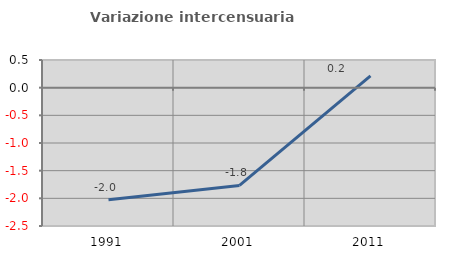
| Category | Variazione intercensuaria annua |
|---|---|
| 1991.0 | -2.025 |
| 2001.0 | -1.767 |
| 2011.0 | 0.211 |